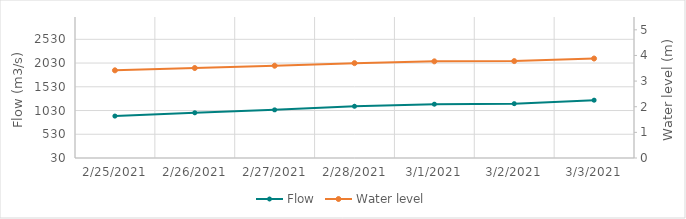
| Category | Flow |
|---|---|
| 2/18/21 | 1414.53 |
| 2/17/21 | 1586.08 |
| 2/16/21 | 1772.68 |
| 2/15/21 | 1925.48 |
| 2/14/21 | 2037.09 |
| 2/13/21 | 2053.99 |
| 2/12/21 | 2045.38 |